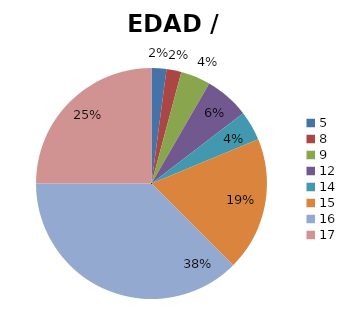
| Category | EDAD / DETENIDOS |
|---|---|
| 5.0 | 1 |
| 8.0 | 1 |
| 9.0 | 2 |
| 12.0 | 3 |
| 14.0 | 2 |
| 15.0 | 9 |
| 16.0 | 18 |
| 17.0 | 12 |